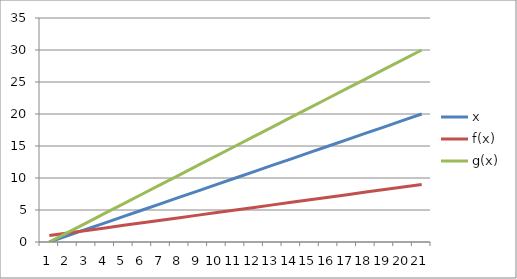
| Category | x | f(x) | g(x) |
|---|---|---|---|
| 0 | 0 | 1 | 0 |
| 1 | 1 | 1.4 | 1.5 |
| 2 | 2 | 1.8 | 3 |
| 3 | 3 | 2.2 | 4.5 |
| 4 | 4 | 2.6 | 6 |
| 5 | 5 | 3 | 7.5 |
| 6 | 6 | 3.4 | 9 |
| 7 | 7 | 3.8 | 10.5 |
| 8 | 8 | 4.2 | 12 |
| 9 | 9 | 4.6 | 13.5 |
| 10 | 10 | 5 | 15 |
| 11 | 11 | 5.4 | 16.5 |
| 12 | 12 | 5.8 | 18 |
| 13 | 13 | 6.2 | 19.5 |
| 14 | 14 | 6.6 | 21 |
| 15 | 15 | 7 | 22.5 |
| 16 | 16 | 7.4 | 24 |
| 17 | 17 | 7.8 | 25.5 |
| 18 | 18 | 8.2 | 27 |
| 19 | 19 | 8.6 | 28.5 |
| 20 | 20 | 9 | 30 |